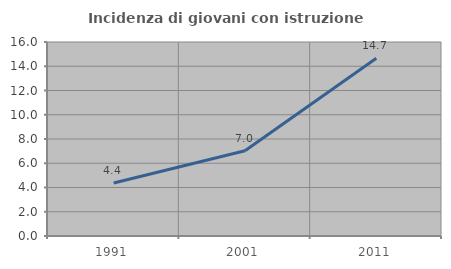
| Category | Incidenza di giovani con istruzione universitaria |
|---|---|
| 1991.0 | 4.365 |
| 2001.0 | 7.037 |
| 2011.0 | 14.658 |